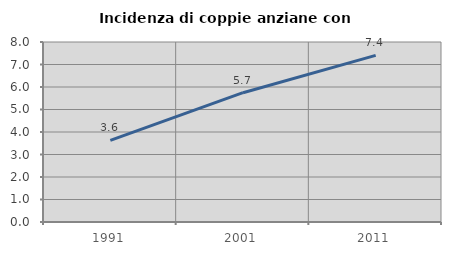
| Category | Incidenza di coppie anziane con figli |
|---|---|
| 1991.0 | 3.629 |
| 2001.0 | 5.747 |
| 2011.0 | 7.407 |